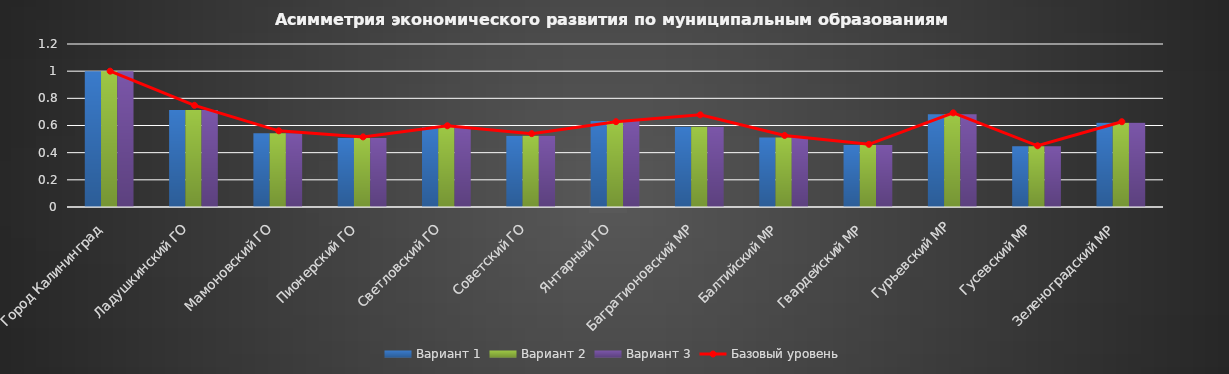
| Category | Вариант 1 | Вариант 2 | Вариант 3 |
|---|---|---|---|
| Город Калининград | 1 | 1 | 1 |
| Ладушкинский ГО | 0.714 | 0.714 | 0.714 |
| Мамоновский ГО | 0.544 | 0.544 | 0.544 |
| Пионерский ГО | 0.509 | 0.509 | 0.509 |
| Светловский ГО | 0.589 | 0.589 | 0.589 |
| Советский ГО | 0.525 | 0.525 | 0.525 |
| Янтарный ГО | 0.633 | 0.633 | 0.633 |
| Багратионовский МР | 0.59 | 0.59 | 0.59 |
| Балтийский МР | 0.513 | 0.513 | 0.513 |
| Гвардейский МР | 0.457 | 0.457 | 0.457 |
| Гурьевский МР | 0.682 | 0.682 | 0.682 |
| Гусевский МР | 0.447 | 0.447 | 0.447 |
| Зеленоградский МР | 0.619 | 0.619 | 0.619 |